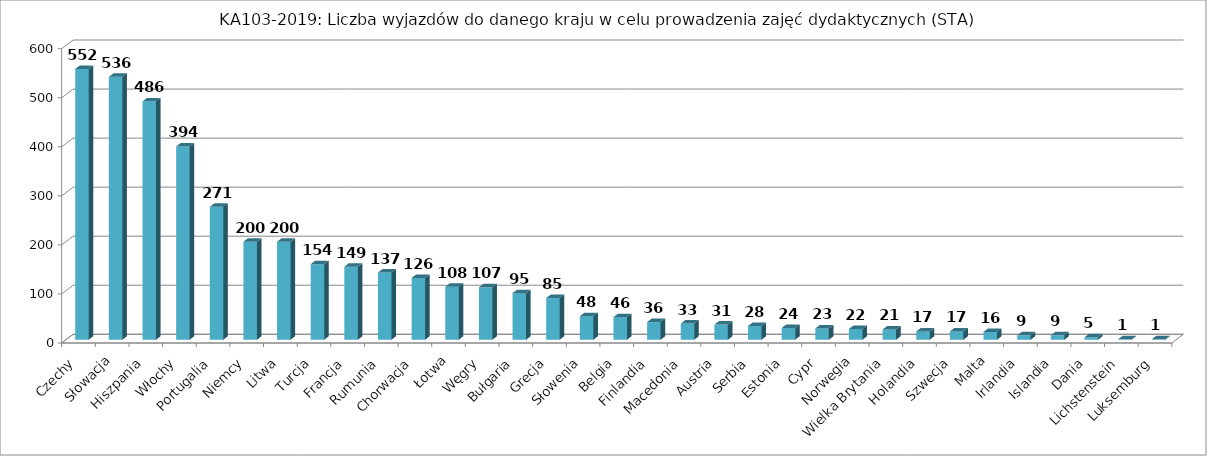
| Category | Liczba wyjazdów w celu prowadzenia zajęć (STA) |
|---|---|
| Czechy | 552 |
| Słowacja | 536 |
| Hiszpania | 486 |
| Włochy | 394 |
| Portugalia | 271 |
| Niemcy | 200 |
| Litwa | 200 |
| Turcja | 154 |
| Francja  | 149 |
| Rumunia | 137 |
| Chorwacja | 126 |
| Łotwa | 108 |
| Węgry | 107 |
| Bułgaria | 95 |
| Grecja | 85 |
| Słowenia | 48 |
| Belgia | 46 |
| Finlandia | 36 |
| Macedonia | 33 |
| Austria | 31 |
| Serbia | 28 |
| Estonia | 24 |
| Cypr | 23 |
| Norwegia | 22 |
| Wielka Brytania | 21 |
| Holandia | 17 |
| Szwecja | 17 |
| Malta | 16 |
| Irlandia | 9 |
| Islandia | 9 |
| Dania | 5 |
| Lichstenstein | 1 |
| Luksemburg | 1 |